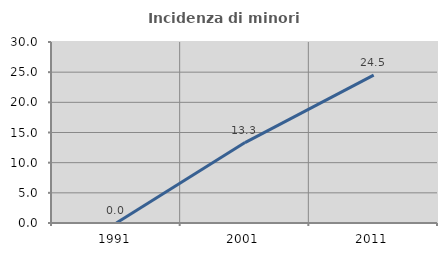
| Category | Incidenza di minori stranieri |
|---|---|
| 1991.0 | 0 |
| 2001.0 | 13.333 |
| 2011.0 | 24.51 |